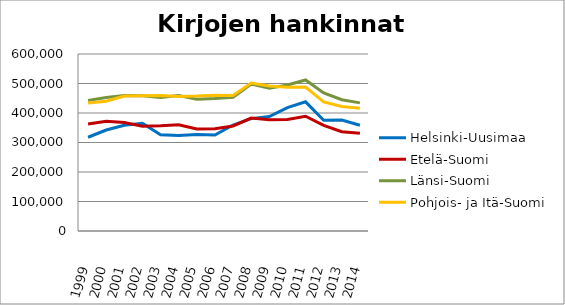
| Category | Helsinki-Uusimaa | Etelä-Suomi | Länsi-Suomi | Pohjois- ja Itä-Suomi |
|---|---|---|---|---|
| 1999.0 | 317837 | 362685 | 442344 | 434068 |
| 2000.0 | 342366 | 372338 | 452317 | 439814 |
| 2001.0 | 358545 | 367682 | 459544 | 457257 |
| 2002.0 | 365481 | 354940 | 458474 | 458783 |
| 2003.0 | 326476 | 356452 | 452761 | 459140 |
| 2004.0 | 323858 | 360212 | 459065 | 456087 |
| 2005.0 | 327172 | 345973 | 446371 | 457238 |
| 2006.0 | 325479 | 346324 | 448977 | 460384 |
| 2007.0 | 359290 | 356019 | 453318 | 459637 |
| 2008.0 | 380957 | 382759 | 498097 | 501579 |
| 2009.0 | 387845 | 377480 | 484262 | 491689 |
| 2010.0 | 418213 | 378183 | 494803 | 487265 |
| 2011.0 | 437855 | 389071 | 511913 | 487856 |
| 2012.0 | 375520 | 357970 | 467865 | 437455 |
| 2013.0 | 376231 | 336556 | 445129 | 421797 |
| 2014.0 | 358666 | 331366 | 434289 | 415930 |